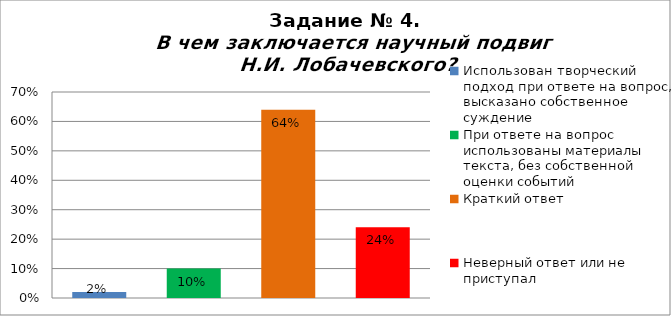
| Category | В чем заключается научный подвиг Н.И. Лобачевского? |
|---|---|
| Использован творческий подход при ответе на вопрос, высказано собственное суждение | 0.02 |
| При ответе на вопрос использованы материалы текста, без собственной оценки событий | 0.1 |
| Краткий ответ | 0.64 |
| Неверный ответ или не приступал | 0.24 |